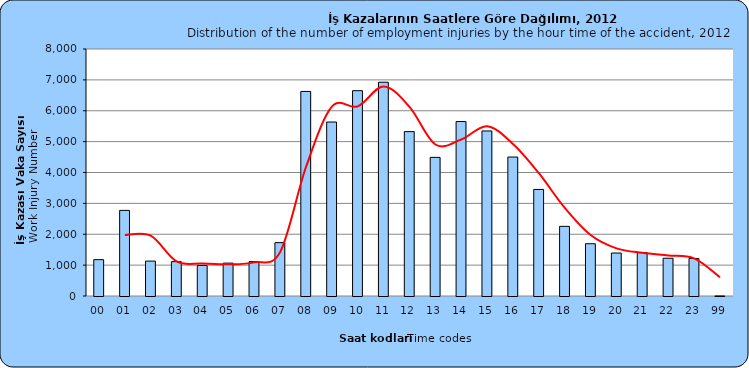
| Category | 2012 |
|---|---|
| 00 | 1177 |
| 01 | 2773 |
| 02 | 1131 |
| 03 | 1113 |
| 04 | 989 |
| 05 | 1065 |
| 06 | 1113 |
| 07 | 1728 |
| 08 | 6626 |
| 09 | 5635 |
| 10 | 6650 |
| 11 | 6924 |
| 12 | 5324 |
| 13 | 4490 |
| 14 | 5651 |
| 15 | 5346 |
| 16 | 4501 |
| 17 | 3451 |
| 18 | 2256 |
| 19 | 1693 |
| 20 | 1392 |
| 21 | 1404 |
| 22 | 1223 |
| 23 | 1215 |
| 99 | 1 |